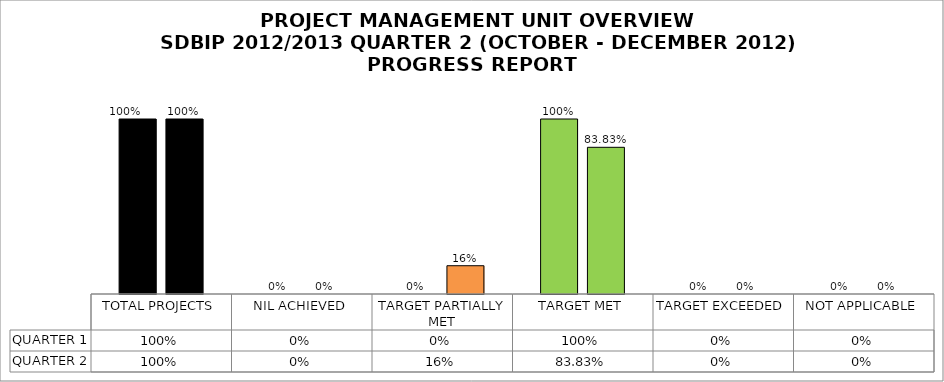
| Category | QUARTER 1 | QUARTER 2 |
|---|---|---|
| TOTAL PROJECTS | 1 | 1 |
| NIL ACHIEVED | 0 | 0 |
| TARGET PARTIALLY MET | 0 | 0.162 |
| TARGET MET | 1 | 0.838 |
| TARGET EXCEEDED | 0 | 0 |
| NOT APPLICABLE | 0 | 0 |